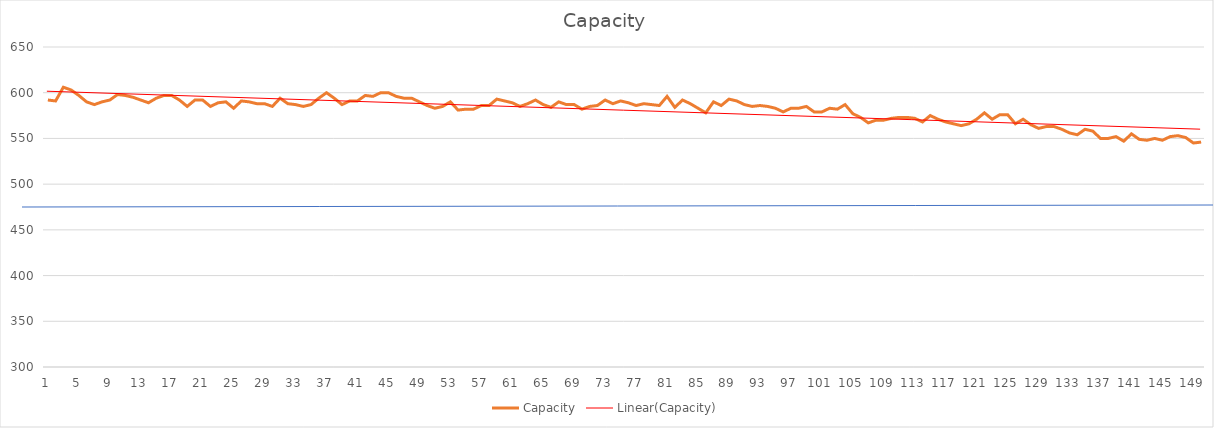
| Category | Capacity |
|---|---|
| 0 | 592 |
| 1 | 591 |
| 2 | 606 |
| 3 | 603 |
| 4 | 597 |
| 5 | 590 |
| 6 | 587 |
| 7 | 590 |
| 8 | 592 |
| 9 | 598 |
| 10 | 597 |
| 11 | 595 |
| 12 | 592 |
| 13 | 589 |
| 14 | 594 |
| 15 | 597 |
| 16 | 597 |
| 17 | 592 |
| 18 | 585 |
| 19 | 592 |
| 20 | 592 |
| 21 | 585 |
| 22 | 589 |
| 23 | 590 |
| 24 | 583 |
| 25 | 591 |
| 26 | 590 |
| 27 | 588 |
| 28 | 588 |
| 29 | 585 |
| 30 | 594 |
| 31 | 588 |
| 32 | 587 |
| 33 | 585 |
| 34 | 587 |
| 35 | 594 |
| 36 | 600 |
| 37 | 594 |
| 38 | 587 |
| 39 | 591 |
| 40 | 591 |
| 41 | 597 |
| 42 | 596 |
| 43 | 600 |
| 44 | 600 |
| 45 | 596 |
| 46 | 594 |
| 47 | 594 |
| 48 | 590 |
| 49 | 586 |
| 50 | 583 |
| 51 | 585 |
| 52 | 590 |
| 53 | 581 |
| 54 | 582 |
| 55 | 582 |
| 56 | 586 |
| 57 | 586 |
| 58 | 593 |
| 59 | 591 |
| 60 | 589 |
| 61 | 585 |
| 62 | 588 |
| 63 | 592 |
| 64 | 587 |
| 65 | 584 |
| 66 | 590 |
| 67 | 587 |
| 68 | 587 |
| 69 | 582 |
| 70 | 585 |
| 71 | 586 |
| 72 | 592 |
| 73 | 588 |
| 74 | 591 |
| 75 | 589 |
| 76 | 586 |
| 77 | 588 |
| 78 | 587 |
| 79 | 586 |
| 80 | 596 |
| 81 | 584 |
| 82 | 592 |
| 83 | 588 |
| 84 | 583 |
| 85 | 578 |
| 86 | 590 |
| 87 | 586 |
| 88 | 593 |
| 89 | 591 |
| 90 | 587 |
| 91 | 585 |
| 92 | 586 |
| 93 | 585 |
| 94 | 583 |
| 95 | 579 |
| 96 | 583 |
| 97 | 583 |
| 98 | 585 |
| 99 | 579 |
| 100 | 579 |
| 101 | 583 |
| 102 | 582 |
| 103 | 587 |
| 104 | 577 |
| 105 | 573 |
| 106 | 567 |
| 107 | 570 |
| 108 | 570 |
| 109 | 572 |
| 110 | 573 |
| 111 | 573 |
| 112 | 572 |
| 113 | 568 |
| 114 | 575 |
| 115 | 571 |
| 116 | 568 |
| 117 | 566 |
| 118 | 564 |
| 119 | 566 |
| 120 | 571 |
| 121 | 578 |
| 122 | 571 |
| 123 | 576 |
| 124 | 576 |
| 125 | 566 |
| 126 | 571 |
| 127 | 565 |
| 128 | 561 |
| 129 | 563 |
| 130 | 563 |
| 131 | 560 |
| 132 | 556 |
| 133 | 554 |
| 134 | 560 |
| 135 | 558 |
| 136 | 550 |
| 137 | 550 |
| 138 | 552 |
| 139 | 547 |
| 140 | 555 |
| 141 | 549 |
| 142 | 548 |
| 143 | 550 |
| 144 | 548 |
| 145 | 552 |
| 146 | 553 |
| 147 | 551 |
| 148 | 545 |
| 149 | 546 |